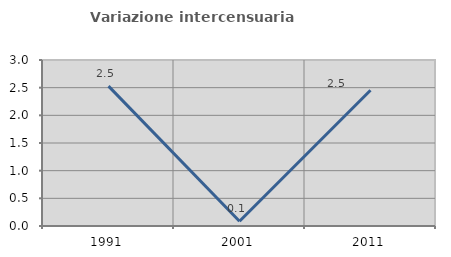
| Category | Variazione intercensuaria annua |
|---|---|
| 1991.0 | 2.528 |
| 2001.0 | 0.087 |
| 2011.0 | 2.453 |